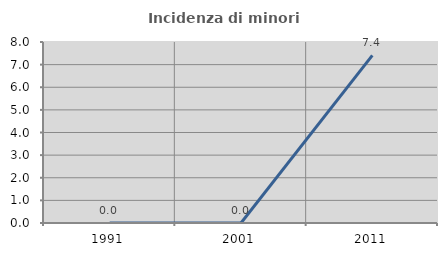
| Category | Incidenza di minori stranieri |
|---|---|
| 1991.0 | 0 |
| 2001.0 | 0 |
| 2011.0 | 7.407 |